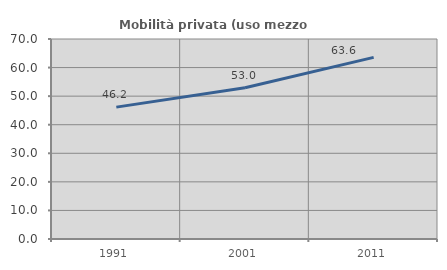
| Category | Mobilità privata (uso mezzo privato) |
|---|---|
| 1991.0 | 46.159 |
| 2001.0 | 52.964 |
| 2011.0 | 63.57 |